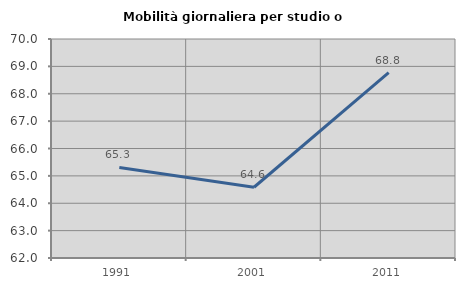
| Category | Mobilità giornaliera per studio o lavoro |
|---|---|
| 1991.0 | 65.307 |
| 2001.0 | 64.585 |
| 2011.0 | 68.77 |